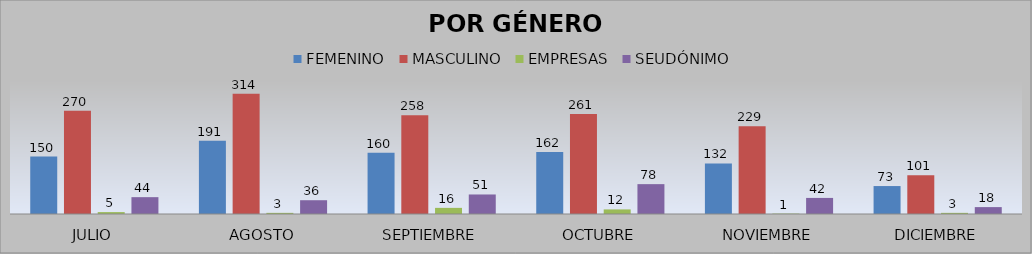
| Category | FEMENINO | MASCULINO | EMPRESAS | SEUDÓNIMO |
|---|---|---|---|---|
| JULIO | 150 | 270 | 5 | 44 |
| AGOSTO | 191 | 314 | 3 | 36 |
| SEPTIEMBRE | 160 | 258 | 16 | 51 |
| OCTUBRE | 162 | 261 | 12 | 78 |
| NOVIEMBRE | 132 | 229 | 1 | 42 |
| DICIEMBRE | 73 | 101 | 3 | 18 |